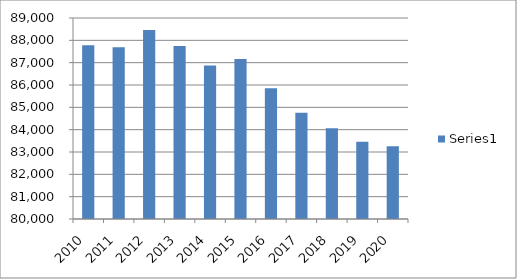
| Category | Series 0 |
|---|---|
| 2010.0 | 87784.729 |
| 2011.0 | 87691.104 |
| 2012.0 | 88458.136 |
| 2013.0 | 87741.327 |
| 2014.0 | 86871.304 |
| 2015.0 | 87161.592 |
| 2016.0 | 85850.378 |
| 2017.0 | 84755.626 |
| 2018.0 | 84067.543 |
| 2019.0 | 83456.318 |
| 2020.0 | 83255.261 |